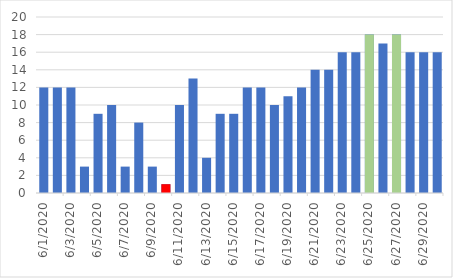
| Category | Température | Series 1 | Series 2 |
|---|---|---|---|
| 6/1/20 | 12 | 0 | 0 |
| 6/2/20 | 12 | 0 | 0 |
| 6/3/20 | 12 | 0 | 0 |
| 6/4/20 | 3 | 0 | 0 |
| 6/5/20 | 9 | 0 | 0 |
| 6/6/20 | 10 | 0 | 0 |
| 6/7/20 | 3 | 0 | 0 |
| 6/8/20 | 8 | 0 | 0 |
| 6/9/20 | 3 | 0 | 0 |
| 6/10/20 | 1 | 1 | 0 |
| 6/11/20 | 10 | 0 | 0 |
| 6/12/20 | 13 | 0 | 0 |
| 6/13/20 | 4 | 0 | 0 |
| 6/14/20 | 9 | 0 | 0 |
| 6/15/20 | 9 | 0 | 0 |
| 6/16/20 | 12 | 0 | 0 |
| 6/17/20 | 12 | 0 | 0 |
| 6/18/20 | 10 | 0 | 0 |
| 6/19/20 | 11 | 0 | 0 |
| 6/20/20 | 12 | 0 | 0 |
| 6/21/20 | 14 | 0 | 0 |
| 6/22/20 | 14 | 0 | 0 |
| 6/23/20 | 16 | 0 | 0 |
| 6/24/20 | 16 | 0 | 0 |
| 6/25/20 | 18 | 0 | 18 |
| 6/26/20 | 17 | 0 | 0 |
| 6/27/20 | 18 | 0 | 18 |
| 6/28/20 | 16 | 0 | 0 |
| 6/29/20 | 16 | 0 | 0 |
| 6/30/20 | 16 | 0 | 0 |